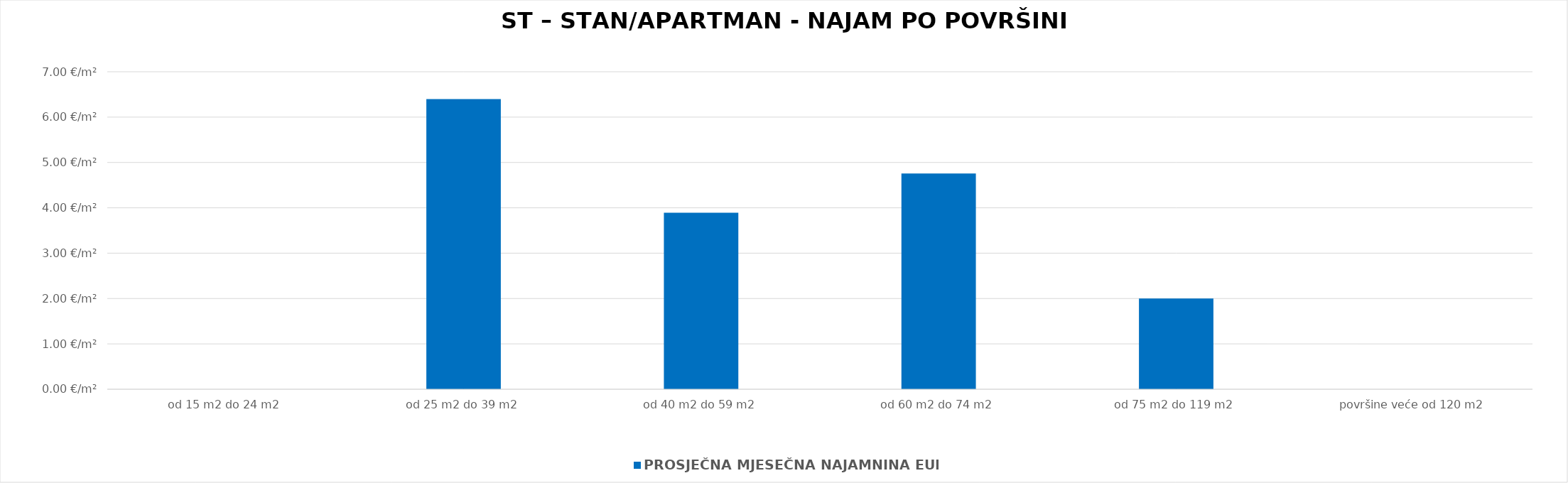
| Category | PROSJEČNA MJESEČNA NAJAMNINA EUR/m² |
|---|---|
| od 15 m2 do 24 m2 | 0 |
| od 25 m2 do 39 m2 | 1900-01-06 09:34:17 |
| od 40 m2 do 59 m2 | 1900-01-03 21:23:42 |
| od 60 m2 do 74 m2 | 1900-01-04 18:09:31 |
| od 75 m2 do 119 m2 | 1900-01-02 |
| površine veće od 120 m2 | 0 |